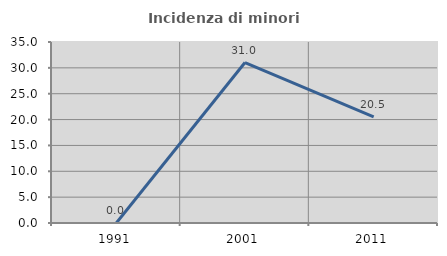
| Category | Incidenza di minori stranieri |
|---|---|
| 1991.0 | 0 |
| 2001.0 | 31.034 |
| 2011.0 | 20.513 |